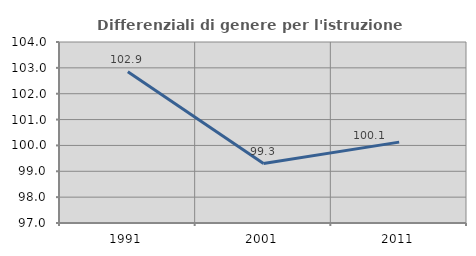
| Category | Differenziali di genere per l'istruzione superiore |
|---|---|
| 1991.0 | 102.851 |
| 2001.0 | 99.3 |
| 2011.0 | 100.127 |